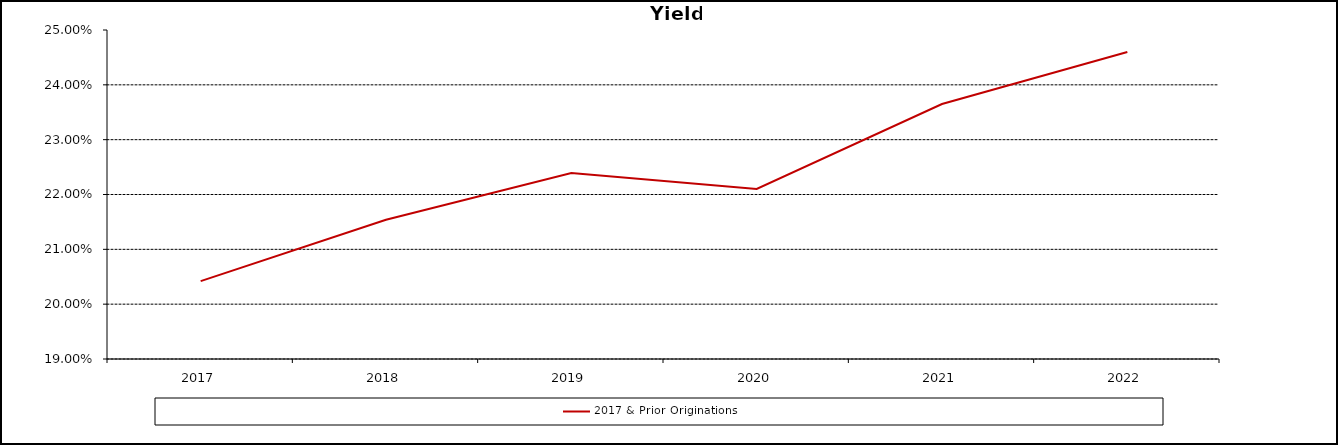
| Category | 2017 & Prior Originations |
|---|---|
| 2017.0 | 0.204 |
| 2018.0 | 0.215 |
| 2019.0 | 0.224 |
| 2020.0 | 0.221 |
| 2021.0 | 0.236 |
| 44926.0 | 0.246 |